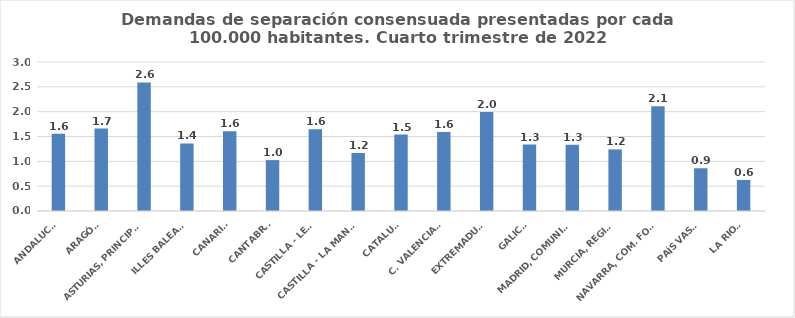
| Category | Series 0 |
|---|---|
| ANDALUCÍA | 1.557 |
| ARAGÓN | 1.659 |
| ASTURIAS, PRINCIPADO | 2.588 |
| ILLES BALEARS | 1.36 |
| CANARIAS | 1.607 |
| CANTABRIA | 1.025 |
| CASTILLA - LEÓN | 1.644 |
| CASTILLA - LA MANCHA | 1.169 |
| CATALUÑA | 1.54 |
| C. VALENCIANA | 1.589 |
| EXTREMADURA | 1.991 |
| GALICIA | 1.338 |
| MADRID, COMUNIDAD | 1.333 |
| MURCIA, REGIÓN | 1.24 |
| NAVARRA, COM. FORAL | 2.108 |
| PAÍS VASCO | 0.86 |
| LA RIOJA | 0.625 |